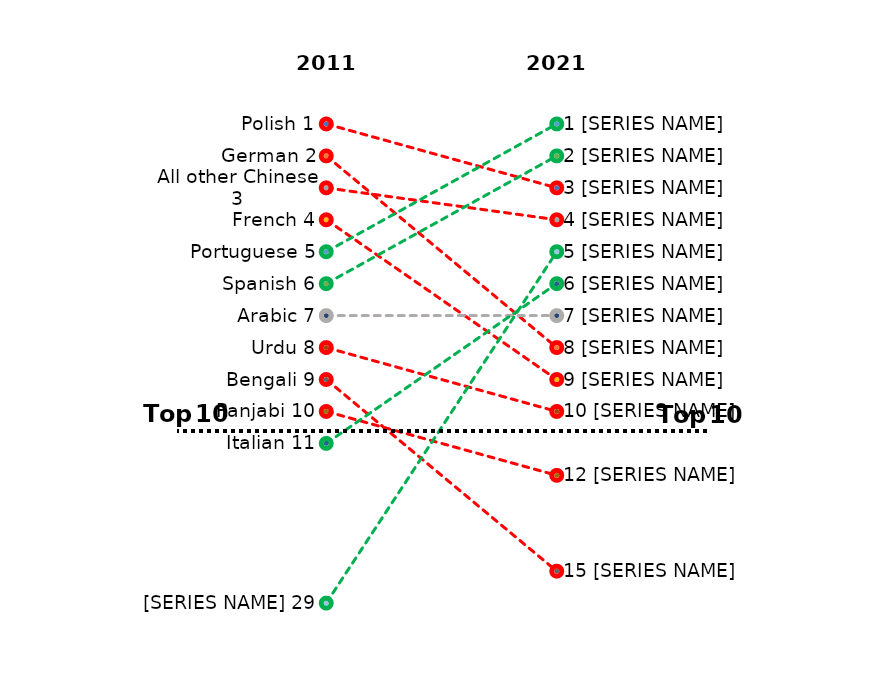
| Category | Polish | German | All other Chinese | French | Portuguese | Spanish | Arabic | Urdu | Bengali | Panjabi | Italian | Romanian |
|---|---|---|---|---|---|---|---|---|---|---|---|---|
| 2011.0 | 1 | 2 | 3 | 4 | 5 | 6 | 7 | 8 | 9 | 10 | 11 | 16 |
| 2021.0 | 3 | 8 | 4 | 9 | 1 | 2 | 7 | 10 | 15 | 12 | 6 | 5 |